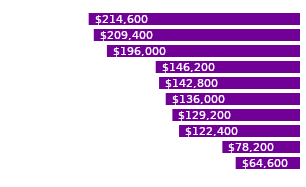
| Category | Series 0 |
|---|---|
| Mich | 214600 |
| John | 209400 |
| Gordon | 196000 |
| Marco | 146200 |
| Una | 142800 |
| Patrick | 136000 |
| Joe | 129200 |
| Kelly | 122400 |
| Ken | 78200 |
| Noah | 64600 |